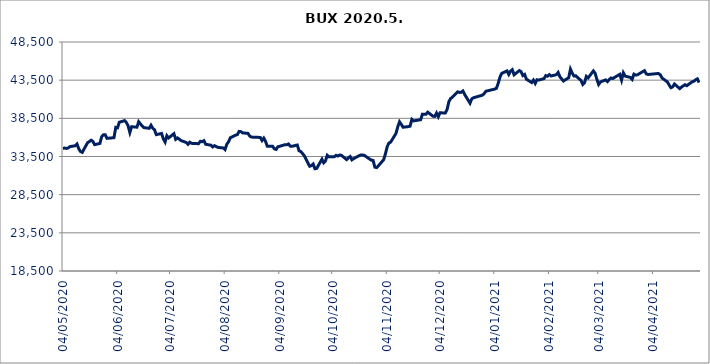
| Category | BUX |
|---|---|
| 04/05/2020 | 34579.44 |
| 05/05/2020 | 34604.44 |
| 06/05/2020 | 34557.171 |
| 07/05/2020 | 34613.571 |
| 08/05/2020 | 34796.129 |
| 11/05/2020 | 34908.118 |
| 12/05/2020 | 35143.127 |
| 13/05/2020 | 34518.754 |
| 14/05/2020 | 34144.567 |
| 15/05/2020 | 34046.129 |
| 18/05/2020 | 35307.506 |
| 19/05/2020 | 35452.207 |
| 20/05/2020 | 35635.523 |
| 21/05/2020 | 35494.523 |
| 22/05/2020 | 35050.922 |
| 25/05/2020 | 35210.597 |
| 26/05/2020 | 36085.775 |
| 27/05/2020 | 36346.09 |
| 28/05/2020 | 36340.471 |
| 29/05/2020 | 35875.708 |
| 02/06/2020 | 35967.411 |
| 03/06/2020 | 37317.039 |
| 04/06/2020 | 37260.063 |
| 05/06/2020 | 37985.661 |
| 08/06/2020 | 38198.174 |
| 09/06/2020 | 37962.291 |
| 10/06/2020 | 37514.793 |
| 11/06/2020 | 36640.642 |
| 12/06/2020 | 37403.565 |
| 15/06/2020 | 37340.839 |
| 16/06/2020 | 38060.734 |
| 17/06/2020 | 37767.718 |
| 18/06/2020 | 37487.457 |
| 19/06/2020 | 37279.817 |
| 22/06/2020 | 37193.114 |
| 23/06/2020 | 37595.825 |
| 24/06/2020 | 37199.463 |
| 25/06/2020 | 37001.937 |
| 26/06/2020 | 36360.438 |
| 29/06/2020 | 36517.169 |
| 30/06/2020 | 35817.883 |
| 01/07/2020 | 35394.54 |
| 02/07/2020 | 36222.58 |
| 03/07/2020 | 35931.52 |
| 06/07/2020 | 36489.42 |
| 07/07/2020 | 35747.71 |
| 08/07/2020 | 35932.39 |
| 09/07/2020 | 35780.4 |
| 10/07/2020 | 35589.6 |
| 13/07/2020 | 35335.86 |
| 14/07/2020 | 35091.72 |
| 15/07/2020 | 35371.88 |
| 16/07/2020 | 35229.08 |
| 17/07/2020 | 35200.88 |
| 20/07/2020 | 35181.69 |
| 21/07/2020 | 35488.15 |
| 22/07/2020 | 35436.39 |
| 23/07/2020 | 35571.72 |
| 24/07/2020 | 35107.97 |
| 27/07/2020 | 34979.41 |
| 28/07/2020 | 34754.08 |
| 29/07/2020 | 34917.01 |
| 30/07/2020 | 34797.24 |
| 31/07/2020 | 34691.74 |
| 03/08/2020 | 34620.25 |
| 04/08/2020 | 34407.2 |
| 05/08/2020 | 35103.39 |
| 06/08/2020 | 35427.82 |
| 07/08/2020 | 35952.53 |
| 10/08/2020 | 36302.78 |
| 11/08/2020 | 36363.83 |
| 12/08/2020 | 36785.28 |
| 13/08/2020 | 36756.82 |
| 14/08/2020 | 36591.83 |
| 17/08/2020 | 36533.57 |
| 18/08/2020 | 36180.74 |
| 19/08/2020 | 36043.56 |
| 24/08/2020 | 35994.83 |
| 25/08/2020 | 35593.67 |
| 26/08/2020 | 35915.81 |
| 27/08/2020 | 35470.36 |
| 28/08/2020 | 34842.51 |
| 31/08/2020 | 34851.29 |
| 01/09/2020 | 34499.9 |
| 02/09/2020 | 34423.7 |
| 03/09/2020 | 34778.2 |
| 04/09/2020 | 34836.82 |
| 07/09/2020 | 35047.88 |
| 08/09/2020 | 35037.61 |
| 09/09/2020 | 35142.74 |
| 10/09/2020 | 34858.03 |
| 11/09/2020 | 34837.99 |
| 14/09/2020 | 35004.24 |
| 15/09/2020 | 34248.86 |
| 16/09/2020 | 34147.59 |
| 17/09/2020 | 33886.79 |
| 18/09/2020 | 33591.51 |
| 21/09/2020 | 32223.2 |
| 22/09/2020 | 32296.74 |
| 23/09/2020 | 32515.39 |
| 24/09/2020 | 31898.01 |
| 25/09/2020 | 31933.26 |
| 28/09/2020 | 33150.26 |
| 29/09/2020 | 32677.72 |
| 30/09/2020 | 32923.53 |
| 01/10/2020 | 33657.71 |
| 02/10/2020 | 33449.84 |
| 05/10/2020 | 33468.11 |
| 06/10/2020 | 33651.55 |
| 07/10/2020 | 33561.05 |
| 08/10/2020 | 33697.94 |
| 09/10/2020 | 33660.44 |
| 12/10/2020 | 33097.01 |
| 13/10/2020 | 33322.71 |
| 14/10/2020 | 33496.67 |
| 15/10/2020 | 33061.27 |
| 16/10/2020 | 33225.15 |
| 19/10/2020 | 33596.79 |
| 20/10/2020 | 33700.78 |
| 21/10/2020 | 33696.73 |
| 22/10/2020 | 33655.1 |
| 26/10/2020 | 33012.62 |
| 27/10/2020 | 32992.69 |
| 28/10/2020 | 32106.78 |
| 29/10/2020 | 32047.68 |
| 30/10/2020 | 32279.17 |
| 02/11/2020 | 33077.55 |
| 03/11/2020 | 33834.43 |
| 04/11/2020 | 34774.72 |
| 05/11/2020 | 35264.98 |
| 06/11/2020 | 35390.44 |
| 09/11/2020 | 36524.01 |
| 10/11/2020 | 37366.63 |
| 11/11/2020 | 38045.8 |
| 12/11/2020 | 37712.82 |
| 13/11/2020 | 37335.1 |
| 16/11/2020 | 37414.6 |
| 17/11/2020 | 37470.5 |
| 18/11/2020 | 38361.82 |
| 19/11/2020 | 38163.61 |
| 20/11/2020 | 38204.67 |
| 23/11/2020 | 38319.06 |
| 24/11/2020 | 39046.5 |
| 25/11/2020 | 39035.1 |
| 26/11/2020 | 39023.56 |
| 27/11/2020 | 39308.9 |
| 30/11/2020 | 38782.16 |
| 01/12/2020 | 38751.98 |
| 02/12/2020 | 39191.11 |
| 03/12/2020 | 38705.12 |
| 04/12/2020 | 39227.87 |
| 07/12/2020 | 39198.31 |
| 08/12/2020 | 39655.97 |
| 09/12/2020 | 40675.89 |
| 10/12/2020 | 41103.01 |
| 11/12/2020 | 41263.67 |
| 14/12/2020 | 41967.89 |
| 15/12/2020 | 41894.09 |
| 16/12/2020 | 41911.27 |
| 17/12/2020 | 42088.03 |
| 18/12/2020 | 41614.92 |
| 21/12/2020 | 40483.17 |
| 22/12/2020 | 41049.52 |
| 23/12/2020 | 41197.14 |
| 28/12/2020 | 41528.44 |
| 29/12/2020 | 41733.11 |
| 30/12/2020 | 42047.586 |
| 04/01/2021 | 42333.48 |
| 05/01/2021 | 42434.3 |
| 06/01/2021 | 43085.06 |
| 07/01/2021 | 43900.7 |
| 08/01/2021 | 44393.21 |
| 11/01/2021 | 44715.79 |
| 12/01/2021 | 44246.56 |
| 13/01/2021 | 44684.36 |
| 14/01/2021 | 44876.42 |
| 15/01/2021 | 44204.45 |
| 18/01/2021 | 44755.59 |
| 19/01/2021 | 44610 |
| 20/01/2021 | 44103.4 |
| 21/01/2021 | 44250.43 |
| 22/01/2021 | 43630.22 |
| 25/01/2021 | 43188.94 |
| 26/01/2021 | 43507.13 |
| 27/01/2021 | 43077.24 |
| 28/01/2021 | 43552.04 |
| 29/01/2021 | 43517.12 |
| 01/02/2021 | 43703.87 |
| 02/02/2021 | 44101.05 |
| 03/02/2021 | 44016.29 |
| 04/02/2021 | 44226.34 |
| 05/02/2021 | 44045.26 |
| 08/02/2021 | 44215.97 |
| 09/02/2021 | 44511.16 |
| 10/02/2021 | 43950.78 |
| 11/02/2021 | 43676.69 |
| 12/02/2021 | 43389.33 |
| 15/02/2021 | 43823.57 |
| 16/02/2021 | 44941.65 |
| 17/02/2021 | 44416.15 |
| 18/02/2021 | 44046.56 |
| 19/02/2021 | 44069.31 |
| 22/02/2021 | 43457.15 |
| 23/02/2021 | 42945.11 |
| 24/02/2021 | 43183.45 |
| 25/02/2021 | 43999.47 |
| 26/02/2021 | 43790.17 |
| 01/03/2021 | 44710.25 |
| 02/03/2021 | 44402.33 |
| 03/03/2021 | 43595.22 |
| 04/03/2021 | 42932.61 |
| 05/03/2021 | 43269 |
| 08/03/2021 | 43540.36 |
| 09/03/2021 | 43312.66 |
| 10/03/2021 | 43579.39 |
| 11/03/2021 | 43784.89 |
| 12/03/2021 | 43711.84 |
| 16/03/2021 | 44268.77 |
| 17/03/2021 | 43504.47 |
| 18/03/2021 | 44465.75 |
| 19/03/2021 | 44042.12 |
| 22/03/2021 | 43851.96 |
| 23/03/2021 | 43603.02 |
| 24/03/2021 | 44290.24 |
| 25/03/2021 | 44168.81 |
| 26/03/2021 | 44201.25 |
| 29/03/2021 | 44617.73 |
| 30/03/2021 | 44746.76 |
| 31/03/2021 | 44326.18 |
| 01/04/2021 | 44242.93 |
| 06/04/2021 | 44357.86 |
| 07/04/2021 | 44357.64 |
| 08/04/2021 | 44194.16 |
| 09/04/2021 | 43775.41 |
| 12/04/2021 | 43267.25 |
| 13/04/2021 | 42865.63 |
| 14/04/2021 | 42514.94 |
| 15/04/2021 | 42626.71 |
| 16/04/2021 | 42997.61 |
| 19/04/2021 | 42388.09 |
| 20/04/2021 | 42597.26 |
| 21/04/2021 | 42753.6 |
| 22/04/2021 | 42906.48 |
| 23/04/2021 | 42772.95 |
| 26/04/2021 | 43281.61 |
| 27/04/2021 | 43357.19 |
| 28/04/2021 | 43549.43 |
| 29/04/2021 | 43665.42 |
| 30/04/2021 | 43183.2 |